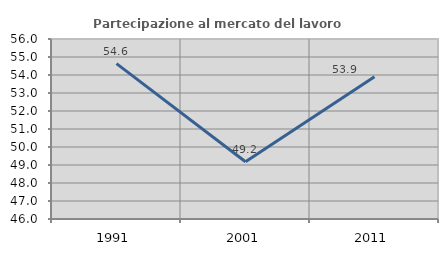
| Category | Partecipazione al mercato del lavoro  femminile |
|---|---|
| 1991.0 | 54.634 |
| 2001.0 | 49.18 |
| 2011.0 | 53.896 |